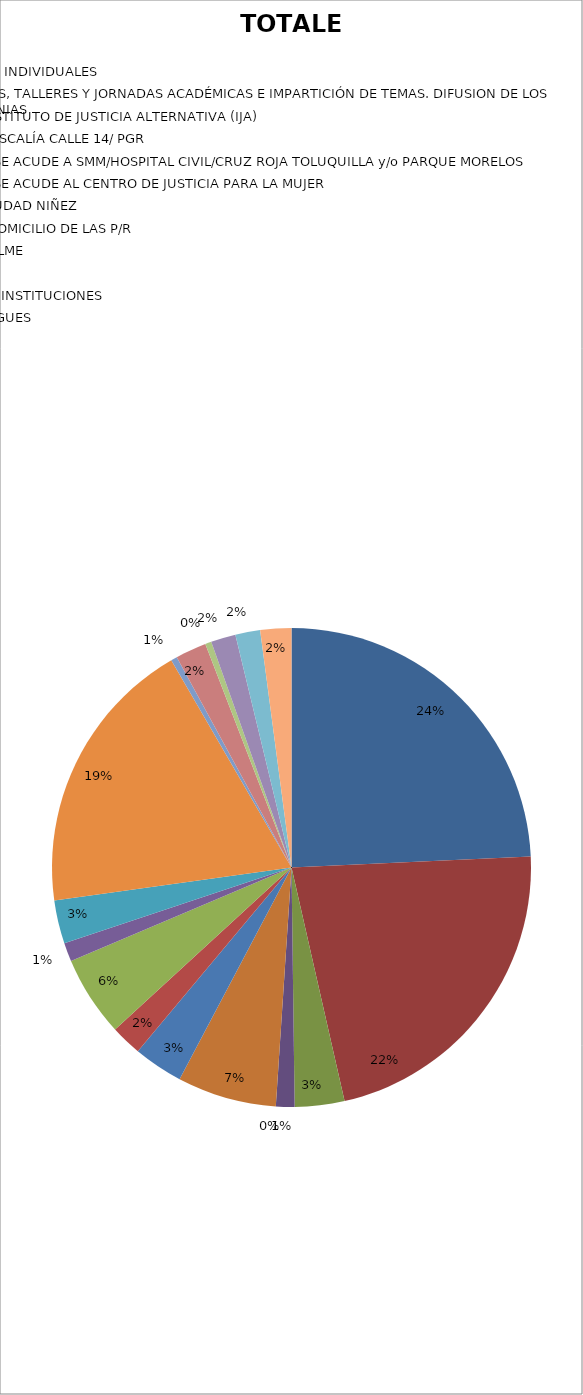
| Category | TOTALES |
|---|---|
| ASESORIAS JURÍDICAS | 58 |
| TERAPIAS PSICOLÓGICAS INDIVIDUALES | 53 |
| ACUDIR A CONFERENCIAS, TALLERES Y JORNADAS ACADÉMICAS E IMPARTICIÓN DE TEMAS. DIFUSION DE LOS SERVICIOS EN LAS COLONIAS | 8 |
| ACOMPAÑAMIENTO A INSTITUTO DE JUSTICIA ALTERNATIVA (IJA) | 3 |
| ACOMPAÑAMIENTOS A FISCALÍA CALLE 14/ PGR | 0 |
| ACOMPAÑAMIENTO Y/O SE ACUDE A SMM/HOSPITAL CIVIL/CRUZ ROJA TOLUQUILLA y/o PARQUE MORELOS | 16 |
| ACOMPAÑAMIENTO Y/O SE ACUDE AL CENTRO DE JUSTICIA PARA LA MUJER | 8 |
| ACOMPAÑAMIENTO A CIUDAD NIÑEZ  | 5 |
| ACOMPAÑAMIENTO AL DOMICILIO DE LAS P/R | 13 |
| ACOMPAÑAMIENTO A SALME | 3 |
| CANALIZACIÓN INTERNA | 7 |
| CANALIZACIÓN A OTRAS INSTITUCIONES | 45 |
| CANALIZACIÓN A ALBERGUES | 1 |
| VISITAS DOMICILIARIAS  | 5 |
| GUARDIAS NOCTURNAS POR PERSONAL DE UVI EN APOYO A PERSONAL DE CANNAT | 1 |
| ENTREGAS CANNAT                       (ACTAS CIRCUNSTANCIADAS) | 4 |
| ATENCIONES CANNAT | 4 |
| ATENCIONES Y AUXILIO PSICOLÓGICO | 5 |